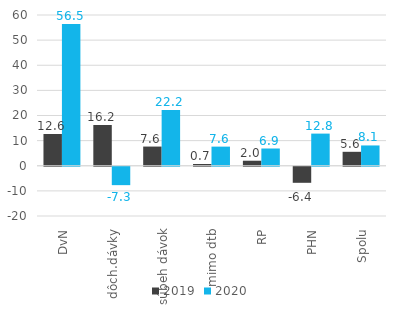
| Category | 2019 | 2020 |
|---|---|---|
| DvN | 12.642 | 56.457 |
| dôch.dávky | 16.219 | -7.321 |
| súbeh dávok | 7.637 | 22.173 |
| mimo dtb | 0.703 | 7.613 |
| RP | 2.002 | 6.865 |
| PHN | -6.389 | 12.792 |
| Spolu | 5.55 | 8.079 |